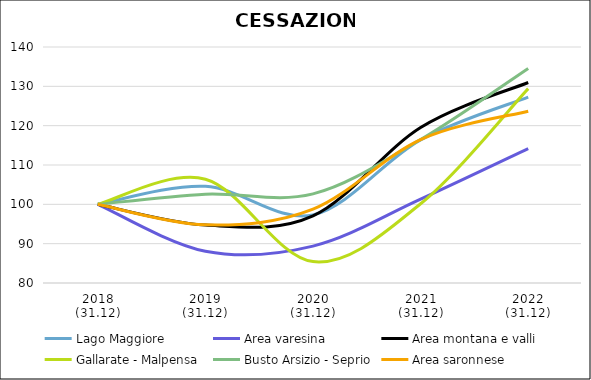
| Category | Lago Maggiore | Area varesina | Area montana e valli | Gallarate - Malpensa | Busto Arsizio - Seprio | Area saronnese |
|---|---|---|---|---|---|---|
| 2018
(31.12) | 100 | 100 | 100 | 100 | 100 | 100 |
| 2019
(31.12) | 104.58 | 88.079 | 94.73 | 106.391 | 102.591 | 94.794 |
| 2020
(31.12) | 97.325 | 89.381 | 97.064 | 85.437 | 102.647 | 98.761 |
| 2021
(31.12) | 116.38 | 101.31 | 119.549 | 100.145 | 116.475 | 116.463 |
| 2022
(31.12) | 127.263 | 114.157 | 130.973 | 129.417 | 134.564 | 123.68 |